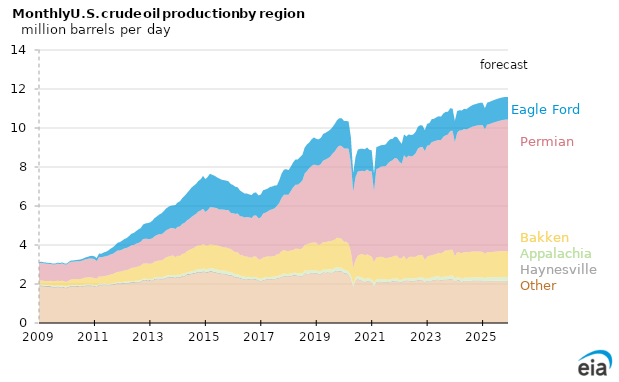
| Category | Other | Haynesville | Appalachia | Bakken | Permian | Eagle Ford |
|---|---|---|---|---|---|---|
| 2009-01-01 | 1.865 | 0.056 | 0.039 | 0.199 | 0.902 | 0.055 |
| 2009-02-01 | 1.885 | 0.054 | 0.04 | 0.205 | 0.904 | 0.055 |
| 2009-03-01 | 1.855 | 0.054 | 0.043 | 0.209 | 0.9 | 0.053 |
| 2009-04-01 | 1.853 | 0.053 | 0.04 | 0.211 | 0.886 | 0.054 |
| 2009-05-01 | 1.848 | 0.051 | 0.04 | 0.219 | 0.876 | 0.051 |
| 2009-06-01 | 1.843 | 0.05 | 0.042 | 0.227 | 0.862 | 0.049 |
| 2009-07-01 | 1.817 | 0.048 | 0.039 | 0.239 | 0.855 | 0.048 |
| 2009-08-01 | 1.807 | 0.049 | 0.04 | 0.243 | 0.862 | 0.048 |
| 2009-09-01 | 1.833 | 0.049 | 0.042 | 0.249 | 0.872 | 0.049 |
| 2009-10-01 | 1.811 | 0.048 | 0.04 | 0.252 | 0.877 | 0.051 |
| 2009-11-01 | 1.821 | 0.049 | 0.04 | 0.256 | 0.889 | 0.053 |
| 2009-12-01 | 1.784 | 0.049 | 0.042 | 0.252 | 0.877 | 0.054 |
| 2010-01-01 | 1.771 | 0.047 | 0.04 | 0.249 | 0.886 | 0.055 |
| 2010-02-01 | 1.826 | 0.048 | 0.04 | 0.271 | 0.907 | 0.055 |
| 2010-03-01 | 1.858 | 0.05 | 0.042 | 0.286 | 0.908 | 0.062 |
| 2010-04-01 | 1.861 | 0.048 | 0.041 | 0.293 | 0.902 | 0.064 |
| 2010-05-01 | 1.854 | 0.047 | 0.041 | 0.309 | 0.911 | 0.07 |
| 2010-06-01 | 1.847 | 0.046 | 0.042 | 0.324 | 0.904 | 0.078 |
| 2010-07-01 | 1.84 | 0.045 | 0.043 | 0.333 | 0.918 | 0.083 |
| 2010-08-01 | 1.858 | 0.045 | 0.043 | 0.342 | 0.923 | 0.087 |
| 2010-09-01 | 1.885 | 0.044 | 0.044 | 0.357 | 0.931 | 0.096 |
| 2010-10-01 | 1.892 | 0.044 | 0.044 | 0.357 | 0.95 | 0.103 |
| 2010-11-01 | 1.888 | 0.046 | 0.044 | 0.37 | 0.964 | 0.119 |
| 2010-12-01 | 1.888 | 0.046 | 0.044 | 0.357 | 0.972 | 0.139 |
| 2011-01-01 | 1.854 | 0.045 | 0.044 | 0.354 | 0.979 | 0.143 |
| 2011-02-01 | 1.823 | 0.045 | 0.045 | 0.361 | 0.903 | 0.154 |
| 2011-03-01 | 1.932 | 0.046 | 0.045 | 0.372 | 0.992 | 0.175 |
| 2011-04-01 | 1.921 | 0.044 | 0.046 | 0.363 | 0.989 | 0.19 |
| 2011-05-01 | 1.934 | 0.045 | 0.047 | 0.376 | 1.001 | 0.213 |
| 2011-06-01 | 1.933 | 0.043 | 0.047 | 0.398 | 1.002 | 0.231 |
| 2011-07-01 | 1.918 | 0.042 | 0.047 | 0.439 | 1.01 | 0.264 |
| 2011-08-01 | 1.937 | 0.041 | 0.05 | 0.458 | 1.03 | 0.297 |
| 2011-09-01 | 1.946 | 0.041 | 0.047 | 0.477 | 1.042 | 0.331 |
| 2011-10-01 | 1.975 | 0.042 | 0.047 | 0.505 | 1.065 | 0.358 |
| 2011-11-01 | 2.002 | 0.044 | 0.049 | 0.525 | 1.097 | 0.401 |
| 2011-12-01 | 1.981 | 0.048 | 0.049 | 0.549 | 1.097 | 0.425 |
| 2012-01-01 | 1.999 | 0.046 | 0.051 | 0.562 | 1.111 | 0.456 |
| 2012-02-01 | 2.026 | 0.046 | 0.052 | 0.575 | 1.126 | 0.483 |
| 2012-03-01 | 2.02 | 0.045 | 0.053 | 0.595 | 1.138 | 0.508 |
| 2012-04-01 | 2.026 | 0.045 | 0.052 | 0.631 | 1.155 | 0.553 |
| 2012-05-01 | 2.069 | 0.044 | 0.051 | 0.663 | 1.162 | 0.588 |
| 2012-06-01 | 2.054 | 0.043 | 0.052 | 0.681 | 1.171 | 0.615 |
| 2012-07-01 | 2.074 | 0.044 | 0.053 | 0.698 | 1.195 | 0.647 |
| 2012-08-01 | 2.073 | 0.044 | 0.056 | 0.728 | 1.205 | 0.693 |
| 2012-09-01 | 2.082 | 0.044 | 0.057 | 0.753 | 1.229 | 0.7 |
| 2012-10-01 | 2.167 | 0.046 | 0.058 | 0.777 | 1.25 | 0.745 |
| 2012-11-01 | 2.179 | 0.046 | 0.06 | 0.764 | 1.274 | 0.78 |
| 2012-12-01 | 2.145 | 0.045 | 0.059 | 0.796 | 1.267 | 0.814 |
| 2013-01-01 | 2.155 | 0.048 | 0.065 | 0.766 | 1.268 | 0.849 |
| 2013-02-01 | 2.124 | 0.049 | 0.066 | 0.81 | 1.292 | 0.895 |
| 2013-03-01 | 2.217 | 0.049 | 0.068 | 0.817 | 1.292 | 0.935 |
| 2013-04-01 | 2.238 | 0.048 | 0.071 | 0.825 | 1.33 | 0.951 |
| 2013-05-01 | 2.239 | 0.047 | 0.074 | 0.842 | 1.345 | 1.013 |
| 2013-06-01 | 2.231 | 0.046 | 0.078 | 0.855 | 1.343 | 1.068 |
| 2013-07-01 | 2.231 | 0.046 | 0.091 | 0.906 | 1.364 | 1.099 |
| 2013-08-01 | 2.291 | 0.046 | 0.092 | 0.945 | 1.38 | 1.118 |
| 2013-09-01 | 2.3 | 0.044 | 0.09 | 0.966 | 1.409 | 1.147 |
| 2013-10-01 | 2.329 | 0.047 | 0.089 | 0.977 | 1.432 | 1.139 |
| 2013-11-01 | 2.315 | 0.047 | 0.092 | 1.01 | 1.407 | 1.158 |
| 2013-12-01 | 2.279 | 0.047 | 0.092 | 0.96 | 1.444 | 1.227 |
| 2014-01-01 | 2.336 | 0.047 | 0.094 | 0.968 | 1.483 | 1.251 |
| 2014-02-01 | 2.31 | 0.048 | 0.098 | 0.982 | 1.513 | 1.293 |
| 2014-03-01 | 2.387 | 0.049 | 0.098 | 1.005 | 1.548 | 1.316 |
| 2014-04-01 | 2.377 | 0.048 | 0.101 | 1.035 | 1.57 | 1.386 |
| 2014-05-01 | 2.458 | 0.048 | 0.104 | 1.067 | 1.585 | 1.394 |
| 2014-06-01 | 2.467 | 0.049 | 0.104 | 1.121 | 1.591 | 1.461 |
| 2014-07-01 | 2.494 | 0.048 | 0.109 | 1.146 | 1.64 | 1.506 |
| 2014-08-01 | 2.514 | 0.049 | 0.114 | 1.164 | 1.68 | 1.523 |
| 2014-09-01 | 2.549 | 0.049 | 0.122 | 1.217 | 1.668 | 1.531 |
| 2014-10-01 | 2.588 | 0.049 | 0.126 | 1.216 | 1.742 | 1.564 |
| 2014-11-01 | 2.569 | 0.049 | 0.132 | 1.222 | 1.796 | 1.604 |
| 2014-12-01 | 2.604 | 0.049 | 0.133 | 1.264 | 1.805 | 1.69 |
| 2015-01-01 | 2.589 | 0.049 | 0.134 | 1.224 | 1.702 | 1.68 |
| 2015-02-01 | 2.564 | 0.049 | 0.141 | 1.214 | 1.815 | 1.709 |
| 2015-03-01 | 2.628 | 0.048 | 0.14 | 1.224 | 1.891 | 1.721 |
| 2015-04-01 | 2.607 | 0.047 | 0.153 | 1.205 | 1.917 | 1.671 |
| 2015-05-01 | 2.569 | 0.045 | 0.156 | 1.234 | 1.91 | 1.637 |
| 2015-06-01 | 2.549 | 0.045 | 0.155 | 1.24 | 1.899 | 1.585 |
| 2015-07-01 | 2.515 | 0.044 | 0.151 | 1.235 | 1.875 | 1.589 |
| 2015-08-01 | 2.502 | 0.043 | 0.149 | 1.214 | 1.915 | 1.53 |
| 2015-09-01 | 2.495 | 0.043 | 0.148 | 1.188 | 1.936 | 1.514 |
| 2015-10-01 | 2.481 | 0.042 | 0.15 | 1.197 | 1.926 | 1.509 |
| 2015-11-01 | 2.428 | 0.043 | 0.147 | 1.204 | 1.965 | 1.478 |
| 2015-12-01 | 2.427 | 0.044 | 0.151 | 1.174 | 1.851 | 1.481 |
| 2016-01-01 | 2.385 | 0.044 | 0.13 | 1.141 | 1.931 | 1.443 |
| 2016-02-01 | 2.313 | 0.042 | 0.128 | 1.138 | 1.97 | 1.394 |
| 2016-03-01 | 2.336 | 0.04 | 0.127 | 1.13 | 1.983 | 1.345 |
| 2016-04-01 | 2.271 | 0.04 | 0.121 | 1.059 | 1.989 | 1.314 |
| 2016-05-01 | 2.248 | 0.039 | 0.121 | 1.064 | 1.989 | 1.257 |
| 2016-06-01 | 2.21 | 0.038 | 0.119 | 1.044 | 2 | 1.227 |
| 2016-07-01 | 2.212 | 0.037 | 0.112 | 1.046 | 2.032 | 1.2 |
| 2016-08-01 | 2.216 | 0.037 | 0.112 | 0.998 | 2.052 | 1.177 |
| 2016-09-01 | 2.206 | 0.038 | 0.11 | 0.987 | 2.043 | 1.182 |
| 2016-10-01 | 2.214 | 0.039 | 0.105 | 1.059 | 2.093 | 1.174 |
| 2016-11-01 | 2.21 | 0.039 | 0.107 | 1.049 | 2.115 | 1.169 |
| 2016-12-01 | 2.151 | 0.039 | 0.105 | 0.957 | 2.119 | 1.171 |
| 2017-01-01 | 2.116 | 0.039 | 0.11 | 0.997 | 2.148 | 1.178 |
| 2017-02-01 | 2.162 | 0.04 | 0.11 | 1.046 | 2.253 | 1.198 |
| 2017-03-01 | 2.2 | 0.039 | 0.109 | 1.036 | 2.272 | 1.192 |
| 2017-04-01 | 2.215 | 0.038 | 0.108 | 1.06 | 2.299 | 1.175 |
| 2017-05-01 | 2.212 | 0.037 | 0.109 | 1.048 | 2.392 | 1.179 |
| 2017-06-01 | 2.227 | 0.037 | 0.109 | 1.043 | 2.415 | 1.169 |
| 2017-07-01 | 2.224 | 0.037 | 0.113 | 1.061 | 2.448 | 1.168 |
| 2017-08-01 | 2.266 | 0.036 | 0.114 | 1.099 | 2.497 | 1.05 |
| 2017-09-01 | 2.289 | 0.037 | 0.113 | 1.113 | 2.601 | 1.172 |
| 2017-10-01 | 2.326 | 0.037 | 0.118 | 1.191 | 2.739 | 1.253 |
| 2017-11-01 | 2.387 | 0.037 | 0.12 | 1.201 | 2.83 | 1.287 |
| 2017-12-01 | 2.361 | 0.038 | 0.117 | 1.182 | 2.883 | 1.307 |
| 2018-01-01 | 2.365 | 0.037 | 0.112 | 1.18 | 2.883 | 1.264 |
| 2018-02-01 | 2.384 | 0.038 | 0.113 | 1.179 | 3.054 | 1.254 |
| 2018-03-01 | 2.421 | 0.037 | 0.114 | 1.165 | 3.213 | 1.284 |
| 2018-04-01 | 2.426 | 0.037 | 0.119 | 1.229 | 3.276 | 1.297 |
| 2018-05-01 | 2.395 | 0.037 | 0.119 | 1.251 | 3.293 | 1.293 |
| 2018-06-01 | 2.384 | 0.036 | 0.119 | 1.238 | 3.402 | 1.332 |
| 2018-07-01 | 2.385 | 0.036 | 0.132 | 1.28 | 3.479 | 1.309 |
| 2018-08-01 | 2.521 | 0.036 | 0.139 | 1.304 | 3.664 | 1.331 |
| 2018-09-01 | 2.496 | 0.036 | 0.141 | 1.368 | 3.753 | 1.365 |
| 2018-10-01 | 2.492 | 0.037 | 0.147 | 1.401 | 3.865 | 1.318 |
| 2018-11-01 | 2.547 | 0.037 | 0.14 | 1.388 | 3.94 | 1.371 |
| 2018-12-01 | 2.537 | 0.037 | 0.139 | 1.411 | 3.998 | 1.392 |
| 2019-01-01 | 2.533 | 0.038 | 0.137 | 1.41 | 3.98 | 1.348 |
| 2019-02-01 | 2.491 | 0.038 | 0.131 | 1.341 | 4.069 | 1.347 |
| 2019-03-01 | 2.492 | 0.038 | 0.126 | 1.4 | 4.102 | 1.338 |
| 2019-04-01 | 2.565 | 0.037 | 0.141 | 1.402 | 4.182 | 1.368 |
| 2019-05-01 | 2.556 | 0.034 | 0.141 | 1.403 | 4.251 | 1.366 |
| 2019-06-01 | 2.569 | 0.035 | 0.144 | 1.43 | 4.266 | 1.381 |
| 2019-07-01 | 2.55 | 0.036 | 0.163 | 1.448 | 4.329 | 1.378 |
| 2019-08-01 | 2.546 | 0.036 | 0.166 | 1.48 | 4.452 | 1.361 |
| 2019-09-01 | 2.621 | 0.036 | 0.169 | 1.445 | 4.528 | 1.406 |
| 2019-10-01 | 2.653 | 0.036 | 0.17 | 1.517 | 4.603 | 1.425 |
| 2019-11-01 | 2.628 | 0.036 | 0.167 | 1.52 | 4.743 | 1.407 |
| 2019-12-01 | 2.64 | 0.037 | 0.163 | 1.476 | 4.763 | 1.426 |
| 2020-01-01 | 2.534 | 0.038 | 0.157 | 1.429 | 4.796 | 1.412 |
| 2020-02-01 | 2.521 | 0.037 | 0.156 | 1.452 | 4.785 | 1.408 |
| 2020-03-01 | 2.442 | 0.037 | 0.147 | 1.437 | 4.874 | 1.399 |
| 2020-04-01 | 2.266 | 0.033 | 0.134 | 1.217 | 4.57 | 1.304 |
| 2020-05-01 | 1.831 | 0.027 | 0.131 | 0.848 | 3.905 | 0.95 |
| 2020-06-01 | 2.166 | 0.031 | 0.136 | 0.888 | 4.26 | 1.034 |
| 2020-07-01 | 2.23 | 0.03 | 0.139 | 1.043 | 4.324 | 1.124 |
| 2020-08-01 | 2.172 | 0.03 | 0.148 | 1.165 | 4.274 | 1.144 |
| 2020-09-01 | 2.138 | 0.03 | 0.154 | 1.219 | 4.264 | 1.128 |
| 2020-10-01 | 2.071 | 0.03 | 0.141 | 1.226 | 4.312 | 1.132 |
| 2020-11-01 | 2.131 | 0.031 | 0.138 | 1.221 | 4.354 | 1.123 |
| 2020-12-01 | 2.106 | 0.032 | 0.139 | 1.186 | 4.326 | 1.091 |
| 2021-01-01 | 2.091 | 0.031 | 0.138 | 1.149 | 4.379 | 1.069 |
| 2021-02-01 | 1.871 | 0.025 | 0.133 | 1.086 | 3.64 | 0.897 |
| 2021-03-01 | 2.064 | 0.031 | 0.139 | 1.112 | 4.541 | 1.119 |
| 2021-04-01 | 2.093 | 0.03 | 0.138 | 1.125 | 4.561 | 1.118 |
| 2021-05-01 | 2.099 | 0.029 | 0.135 | 1.131 | 4.623 | 1.1 |
| 2021-06-01 | 2.082 | 0.029 | 0.132 | 1.134 | 4.657 | 1.097 |
| 2021-07-01 | 2.082 | 0.029 | 0.12 | 1.079 | 4.726 | 1.116 |
| 2021-08-01 | 2.066 | 0.029 | 0.125 | 1.121 | 4.835 | 1.127 |
| 2021-09-01 | 2.087 | 0.03 | 0.127 | 1.128 | 4.915 | 1.132 |
| 2021-10-01 | 2.121 | 0.032 | 0.118 | 1.124 | 4.953 | 1.094 |
| 2021-11-01 | 2.129 | 0.033 | 0.117 | 1.175 | 5.006 | 1.096 |
| 2021-12-01 | 2.141 | 0.033 | 0.115 | 1.158 | 4.985 | 1.094 |
| 2022-01-01 | 2.057 | 0.033 | 0.114 | 1.103 | 4.962 | 1.074 |
| 2022-02-01 | 2.069 | 0.032 | 0.116 | 1.108 | 4.844 | 1.019 |
| 2022-03-01 | 2.142 | 0.035 | 0.119 | 1.142 | 5.167 | 1.068 |
| 2022-04-01 | 2.153 | 0.034 | 0.126 | 0.927 | 5.235 | 1.092 |
| 2022-05-01 | 2.149 | 0.033 | 0.124 | 1.074 | 5.204 | 1.089 |
| 2022-06-01 | 2.124 | 0.031 | 0.121 | 1.122 | 5.134 | 1.106 |
| 2022-07-01 | 2.139 | 0.031 | 0.125 | 1.094 | 5.194 | 1.086 |
| 2022-08-01 | 2.144 | 0.032 | 0.123 | 1.095 | 5.306 | 1.103 |
| 2022-09-01 | 2.165 | 0.033 | 0.123 | 1.143 | 5.476 | 1.123 |
| 2022-10-01 | 2.186 | 0.033 | 0.131 | 1.136 | 5.533 | 1.129 |
| 2022-11-01 | 2.193 | 0.031 | 0.136 | 1.121 | 5.554 | 1.091 |
| 2022-12-01 | 2.081 | 0.031 | 0.131 | 0.984 | 5.587 | 1.083 |
| 2023-01-01 | 2.125 | 0.032 | 0.154 | 1.082 | 5.697 | 1.122 |
| 2023-02-01 | 2.093 | 0.032 | 0.161 | 1.162 | 5.673 | 1.132 |
| 2023-03-01 | 2.15 | 0.032 | 0.16 | 1.131 | 5.802 | 1.181 |
| 2023-04-01 | 2.173 | 0.031 | 0.161 | 1.141 | 5.813 | 1.155 |
| 2023-05-01 | 2.198 | 0.032 | 0.162 | 1.154 | 5.808 | 1.193 |
| 2023-06-01 | 2.205 | 0.029 | 0.155 | 1.202 | 5.801 | 1.211 |
| 2023-07-01 | 2.168 | 0.03 | 0.145 | 1.219 | 5.816 | 1.206 |
| 2023-08-01 | 2.198 | 0.03 | 0.148 | 1.266 | 5.908 | 1.196 |
| 2023-09-01 | 2.196 | 0.029 | 0.15 | 1.346 | 5.904 | 1.2 |
| 2023-10-01 | 2.21 | 0.031 | 0.164 | 1.311 | 5.951 | 1.167 |
| 2023-11-01 | 2.229 | 0.03 | 0.167 | 1.327 | 6.093 | 1.165 |
| 2023-12-01 | 2.246 | 0.033 | 0.159 | 1.312 | 6.109 | 1.139 |
| 2024-01-01 | 2.097 | 0.03 | 0.155 | 1.14 | 5.851 | 1.1 |
| 2024-02-01 | 2.17 | 0.03 | 0.143 | 1.289 | 6.121 | 1.117 |
| 2024-03-01 | 2.182 | 0.031 | 0.14 | 1.258 | 6.263 | 1.042 |
| 2024-04-01 | 2.074 | 0.031 | 0.147 | 1.324 | 6.302 | 1.017 |
| 2024-05-01 | 2.138 | 0.031 | 0.151 | 1.313 | 6.317 | 1.032 |
| 2024-06-01 | 2.137 | 0.031 | 0.153 | 1.304 | 6.293 | 1.047 |
| 2024-07-01 | 2.135 | 0.031 | 0.155 | 1.315 | 6.349 | 1.068 |
| 2024-08-01 | 2.14 | 0.031 | 0.157 | 1.324 | 6.386 | 1.093 |
| 2024-09-01 | 2.145 | 0.031 | 0.16 | 1.33 | 6.414 | 1.115 |
| 2024-10-01 | 2.148 | 0.03 | 0.162 | 1.332 | 6.439 | 1.116 |
| 2024-11-01 | 2.149 | 0.03 | 0.166 | 1.327 | 6.464 | 1.13 |
| 2024-12-01 | 2.146 | 0.03 | 0.17 | 1.314 | 6.487 | 1.143 |
| 2025-01-01 | 2.142 | 0.03 | 0.174 | 1.298 | 6.507 | 1.139 |
| 2025-02-01 | 2.088 | 0.03 | 0.178 | 1.254 | 6.385 | 1.081 |
| 2025-03-01 | 2.135 | 0.03 | 0.182 | 1.279 | 6.545 | 1.131 |
| 2025-04-01 | 2.134 | 0.03 | 0.184 | 1.281 | 6.574 | 1.138 |
| 2025-05-01 | 2.136 | 0.03 | 0.186 | 1.288 | 6.606 | 1.145 |
| 2025-06-01 | 2.138 | 0.03 | 0.187 | 1.297 | 6.634 | 1.151 |
| 2025-07-01 | 2.14 | 0.03 | 0.188 | 1.307 | 6.658 | 1.156 |
| 2025-08-01 | 2.142 | 0.03 | 0.188 | 1.316 | 6.683 | 1.159 |
| 2025-09-01 | 2.142 | 0.03 | 0.189 | 1.323 | 6.706 | 1.161 |
| 2025-10-01 | 2.141 | 0.03 | 0.19 | 1.326 | 6.728 | 1.161 |
| 2025-11-01 | 2.137 | 0.03 | 0.192 | 1.322 | 6.75 | 1.161 |
| 2025-12-01 | 2.13 | 0.03 | 0.195 | 1.312 | 6.77 | 1.16 |